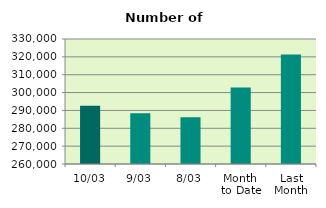
| Category | Series 0 |
|---|---|
| 10/03 | 292618 |
| 9/03 | 288476 |
| 8/03 | 286194 |
| Month 
to Date | 302846.5 |
| Last
Month | 321374.6 |